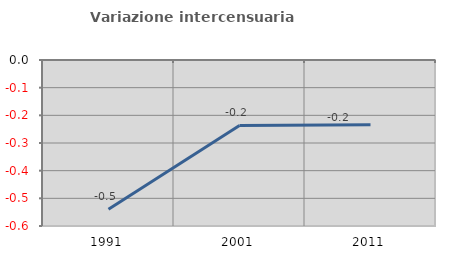
| Category | Variazione intercensuaria annua |
|---|---|
| 1991.0 | -0.54 |
| 2001.0 | -0.237 |
| 2011.0 | -0.234 |